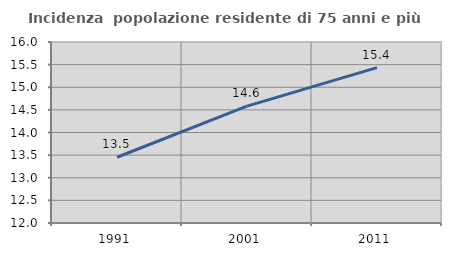
| Category | Incidenza  popolazione residente di 75 anni e più |
|---|---|
| 1991.0 | 13.453 |
| 2001.0 | 14.582 |
| 2011.0 | 15.433 |